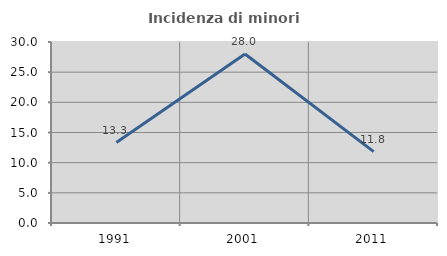
| Category | Incidenza di minori stranieri |
|---|---|
| 1991.0 | 13.333 |
| 2001.0 | 28 |
| 2011.0 | 11.834 |